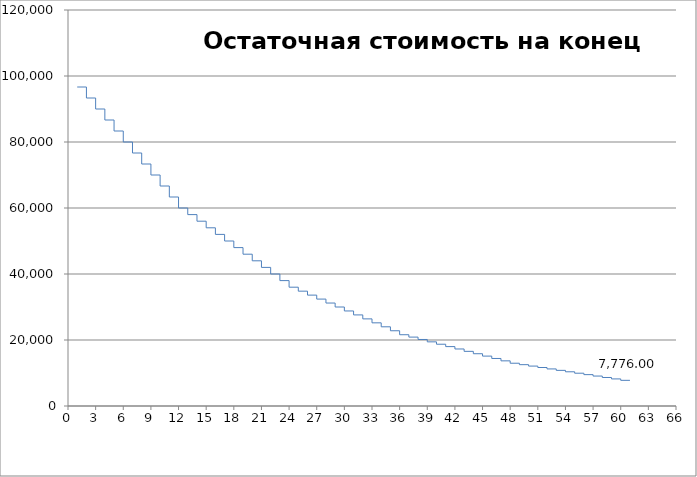
| Category | Остаточная стоимость на конец месяца |
|---|---|
| 1.0 | 96666.667 |
| 2.0 | 96666.667 |
| 2.0 | 93333.333 |
| 3.0 | 93333.333 |
| 3.0 | 90000 |
| 4.0 | 90000 |
| 4.0 | 86666.667 |
| 5.0 | 86666.667 |
| 5.0 | 83333.333 |
| 6.0 | 83333.333 |
| 6.0 | 80000 |
| 7.0 | 80000 |
| 7.0 | 76666.667 |
| 8.0 | 76666.667 |
| 8.0 | 73333.333 |
| 9.0 | 73333.333 |
| 9.0 | 70000 |
| 10.0 | 70000 |
| 10.0 | 66666.667 |
| 11.0 | 66666.667 |
| 11.0 | 63333.333 |
| 12.0 | 63333.333 |
| 12.0 | 60000 |
| 13.0 | 60000 |
| 13.0 | 58000 |
| 14.0 | 58000 |
| 14.0 | 56000 |
| 15.0 | 56000 |
| 15.0 | 54000 |
| 16.0 | 54000 |
| 16.0 | 52000 |
| 17.0 | 52000 |
| 17.0 | 50000 |
| 18.0 | 50000 |
| 18.0 | 48000 |
| 19.0 | 48000 |
| 19.0 | 46000 |
| 20.0 | 46000 |
| 20.0 | 44000 |
| 21.0 | 44000 |
| 21.0 | 42000 |
| 22.0 | 42000 |
| 22.0 | 40000 |
| 23.0 | 40000 |
| 23.0 | 38000 |
| 24.0 | 38000 |
| 24.0 | 36000 |
| 25.0 | 36000 |
| 25.0 | 34800 |
| 26.0 | 34800 |
| 26.0 | 33600 |
| 27.0 | 33600 |
| 27.0 | 32400 |
| 28.0 | 32400 |
| 28.0 | 31200 |
| 29.0 | 31200 |
| 29.0 | 30000 |
| 30.0 | 30000 |
| 30.0 | 28800 |
| 31.0 | 28800 |
| 31.0 | 27600 |
| 32.0 | 27600 |
| 32.0 | 26400 |
| 33.0 | 26400 |
| 33.0 | 25200 |
| 34.0 | 25200 |
| 34.0 | 24000 |
| 35.0 | 24000 |
| 35.0 | 22800 |
| 36.0 | 22800 |
| 36.0 | 21600 |
| 37.0 | 21600 |
| 37.0 | 20880 |
| 38.0 | 20880 |
| 38.0 | 20160 |
| 39.0 | 20160 |
| 39.0 | 19440 |
| 40.0 | 19440 |
| 40.0 | 18720 |
| 41.0 | 18720 |
| 41.0 | 18000 |
| 42.0 | 18000 |
| 42.0 | 17280 |
| 43.0 | 17280 |
| 43.0 | 16560 |
| 44.0 | 16560 |
| 44.0 | 15840 |
| 45.0 | 15840 |
| 45.0 | 15120 |
| 46.0 | 15120 |
| 46.0 | 14400 |
| 47.0 | 14400 |
| 47.0 | 13680 |
| 48.0 | 13680 |
| 48.0 | 12960 |
| 49.0 | 12960 |
| 49.0 | 12528 |
| 50.0 | 12528 |
| 50.0 | 12096 |
| 51.0 | 12096 |
| 51.0 | 11664 |
| 52.0 | 11664 |
| 52.0 | 11232 |
| 53.0 | 11232 |
| 53.0 | 10800 |
| 54.0 | 10800 |
| 54.0 | 10368 |
| 55.0 | 10368 |
| 55.0 | 9936 |
| 56.0 | 9936 |
| 56.0 | 9504 |
| 57.0 | 9504 |
| 57.0 | 9072 |
| 58.0 | 9072 |
| 58.0 | 8640 |
| 59.0 | 8640 |
| 59.0 | 8208 |
| 60.0 | 8208 |
| 60.0 | 7776 |
| 61.0 | 7776 |